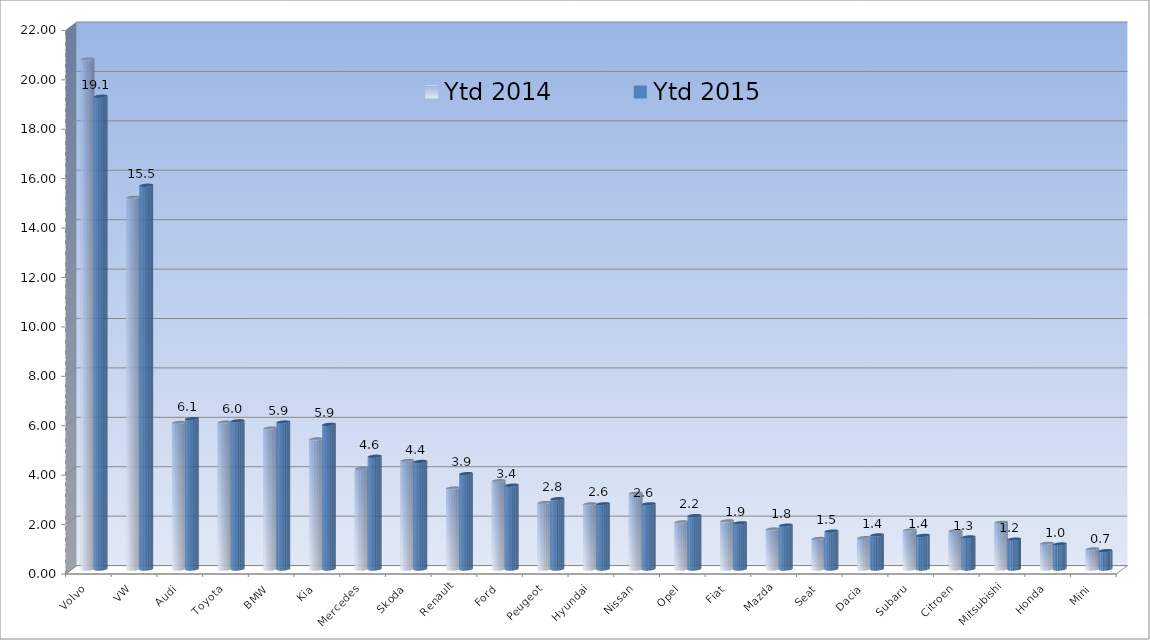
| Category | Ytd 2014 | Ytd 2015 |
|---|---|---|
| Volvo | 20.637 | 19.135 |
| VW | 15.043 | 15.531 |
| Audi | 5.929 | 6.087 |
| Toyota | 5.942 | 5.998 |
| BMW | 5.704 | 5.948 |
| Kia | 5.261 | 5.852 |
| Mercedes | 4.063 | 4.562 |
| Skoda | 4.39 | 4.351 |
| Renault | 3.277 | 3.861 |
| Ford | 3.571 | 3.392 |
| Peugeot | 2.688 | 2.846 |
| Hyundai | 2.633 | 2.639 |
| Nissan | 3.067 | 2.638 |
| Opel | 1.904 | 2.162 |
| Fiat | 1.945 | 1.867 |
| Mazda | 1.617 | 1.775 |
| Seat | 1.234 | 1.533 |
| Dacia | 1.266 | 1.379 |
| Subaru | 1.576 | 1.359 |
| Citroen | 1.551 | 1.297 |
| Mitsubishi | 1.889 | 1.21 |
| Honda | 1.038 | 1.012 |
| Mini | 0.81 | 0.743 |